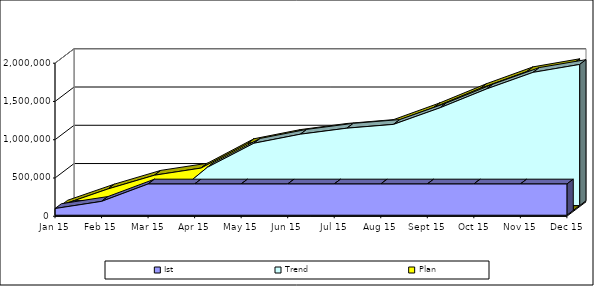
| Category | Ist | Trend | Plan |
|---|---|---|---|
| 2015-01-01 | 87354 | 0 | 70000 |
| 2015-02-01 | 180821 | 0 | 280000 |
| 2015-03-01 | 407995 | 0 | 460000 |
| 2015-04-01 | 407995 | 499602.263 | 553000 |
| 2015-05-01 | 407995 | 814810.052 | 873000 |
| 2015-06-01 | 407995 | 933012.972 | 993000 |
| 2015-07-01 | 407995 | 1011814.92 | 1073000 |
| 2015-08-01 | 407995 | 1061066.137 | 1123000 |
| 2015-09-01 | 407995 | 1277771.491 | 1343000 |
| 2015-10-01 | 407995 | 1524027.576 | 1593000 |
| 2015-11-01 | 407995 | 1740732.93 | 1813000 |
| 2015-12-01 | 407995 | 1844160.486 | 1918000 |